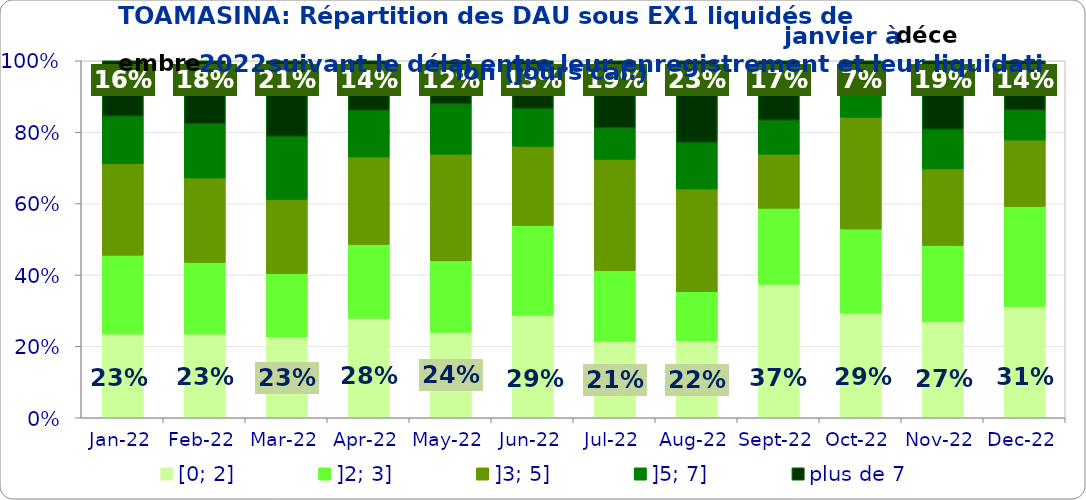
| Category | [0; 2] | ]2; 3] | ]3; 5] | ]5; 7] | plus de 7 |
|---|---|---|---|---|---|
| 2022-01-01 | 0.235 | 0.221 | 0.256 | 0.133 | 0.155 |
| 2022-02-01 | 0.235 | 0.2 | 0.236 | 0.152 | 0.177 |
| 2022-03-01 | 0.227 | 0.177 | 0.208 | 0.177 | 0.212 |
| 2022-04-01 | 0.278 | 0.207 | 0.245 | 0.131 | 0.138 |
| 2022-05-01 | 0.24 | 0.2 | 0.299 | 0.141 | 0.121 |
| 2022-06-01 | 0.287 | 0.251 | 0.222 | 0.106 | 0.134 |
| 2022-07-01 | 0.214 | 0.198 | 0.312 | 0.088 | 0.188 |
| 2022-08-01 | 0.216 | 0.137 | 0.288 | 0.131 | 0.228 |
| 2022-09-01 | 0.374 | 0.213 | 0.152 | 0.095 | 0.166 |
| 2022-10-01 | 0.293 | 0.236 | 0.313 | 0.084 | 0.075 |
| 2022-11-01 | 0.269 | 0.214 | 0.214 | 0.111 | 0.192 |
| 2022-12-01 | 0.312 | 0.28 | 0.186 | 0.084 | 0.138 |